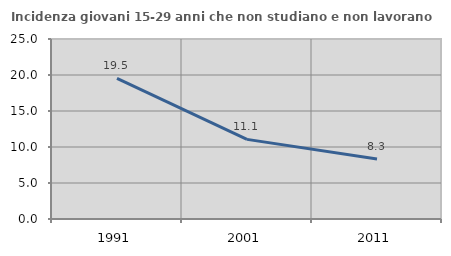
| Category | Incidenza giovani 15-29 anni che non studiano e non lavorano  |
|---|---|
| 1991.0 | 19.536 |
| 2001.0 | 11.06 |
| 2011.0 | 8.333 |